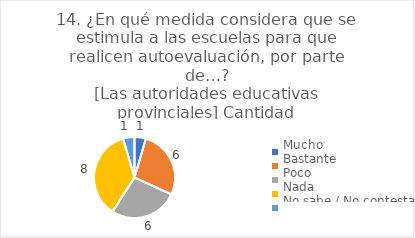
| Category | 14. ¿En qué medida considera que se estimula a las escuelas para que realicen autoevaluación, por parte de…?
[Las autoridades educativas provinciales] |
|---|---|
| Mucho  | 0.045 |
| Bastante  | 0.273 |
| Poco  | 0.273 |
| Nada  | 0.364 |
| No sabe / No contesta | 0.045 |